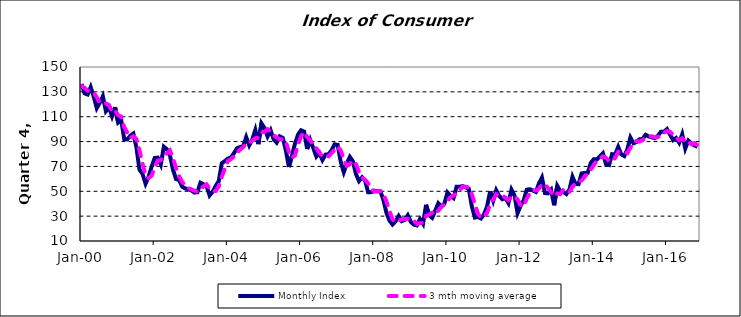
| Category | Monthly Index | 3 mth moving average |
|---|---|---|
| 2000-01-01 | 136.39 | 134.769 |
| 2000-02-01 | 128.83 | 133.196 |
| 2000-03-01 | 127.87 | 131.03 |
| 2000-04-01 | 133.808 | 130.17 |
| 2000-05-01 | 126.234 | 129.304 |
| 2000-06-01 | 116.898 | 125.647 |
| 2000-07-01 | 121.315 | 121.482 |
| 2000-08-01 | 126.388 | 121.534 |
| 2000-09-01 | 114.421 | 120.708 |
| 2000-10-01 | 117.451 | 119.42 |
| 2000-11-01 | 110.366 | 114.079 |
| 2000-12-01 | 117.635 | 115.151 |
| 2001-01-01 | 105.36 | 111.12 |
| 2001-02-01 | 107.559 | 110.184 |
| 2001-03-01 | 92.035 | 101.651 |
| 2001-04-01 | 91.744 | 97.113 |
| 2001-05-01 | 94.719 | 92.833 |
| 2001-06-01 | 96.453 | 94.305 |
| 2001-07-01 | 85.411 | 92.194 |
| 2001-08-01 | 67.414 | 83.093 |
| 2001-09-01 | 64.075 | 72.3 |
| 2001-10-01 | 56.085 | 62.525 |
| 2001-11-01 | 61.702 | 60.621 |
| 2001-12-01 | 69.937 | 62.575 |
| 2002-01-01 | 76.81 | 69.483 |
| 2002-02-01 | 77.08 | 74.609 |
| 2002-03-01 | 71.629 | 75.173 |
| 2002-04-01 | 85.831 | 78.18 |
| 2002-05-01 | 83.795 | 80.418 |
| 2002-06-01 | 78.905 | 82.844 |
| 2002-07-01 | 67.374 | 76.691 |
| 2002-08-01 | 59.832 | 68.703 |
| 2002-09-01 | 59.111 | 62.105 |
| 2002-10-01 | 53.696 | 57.546 |
| 2002-11-01 | 52.312 | 55.04 |
| 2002-12-01 | 51.679 | 52.562 |
| 2003-01-01 | 50.696 | 51.562 |
| 2003-02-01 | 49.029 | 50.468 |
| 2003-03-01 | 49.193 | 49.639 |
| 2003-04-01 | 56.879 | 51.7 |
| 2003-05-01 | 55.689 | 53.92 |
| 2003-06-01 | 54.224 | 55.598 |
| 2003-07-01 | 46.672 | 52.195 |
| 2003-08-01 | 49.648 | 50.182 |
| 2003-09-01 | 54.366 | 50.229 |
| 2003-10-01 | 58.069 | 54.028 |
| 2003-11-01 | 72.593 | 61.676 |
| 2003-12-01 | 74.28 | 68.314 |
| 2004-01-01 | 76.295 | 74.389 |
| 2004-02-01 | 77.202 | 75.925 |
| 2004-03-01 | 80.7 | 78.065 |
| 2004-04-01 | 84.661 | 80.854 |
| 2004-05-01 | 85.54 | 83.634 |
| 2004-06-01 | 86.268 | 85.49 |
| 2004-07-01 | 93.601 | 88.47 |
| 2004-08-01 | 86.964 | 88.944 |
| 2004-09-01 | 91.735 | 90.767 |
| 2004-10-01 | 99.325 | 92.675 |
| 2004-11-01 | 87.933 | 92.998 |
| 2004-12-01 | 104.713 | 97.324 |
| 2005-01-01 | 100.93 | 97.859 |
| 2005-02-01 | 94.183 | 99.942 |
| 2005-03-01 | 99.126 | 98.08 |
| 2005-04-01 | 91.93 | 95.08 |
| 2005-05-01 | 89.176 | 93.411 |
| 2005-06-01 | 94.185 | 91.764 |
| 2005-07-01 | 92.95 | 92.104 |
| 2005-08-01 | 83.038 | 90.058 |
| 2005-09-01 | 69.518 | 81.835 |
| 2005-10-01 | 78.597 | 77.051 |
| 2005-11-01 | 88.285 | 78.8 |
| 2005-12-01 | 95.591 | 87.491 |
| 2006-01-01 | 99.091 | 94.322 |
| 2006-02-01 | 98.049 | 97.577 |
| 2006-03-01 | 83.987 | 93.709 |
| 2006-04-01 | 91.366 | 91.134 |
| 2006-05-01 | 84.819 | 86.724 |
| 2006-06-01 | 77.945 | 84.71 |
| 2006-07-01 | 80.872 | 81.212 |
| 2006-08-01 | 75.132 | 77.983 |
| 2006-09-01 | 79.536 | 78.513 |
| 2006-10-01 | 79.805 | 78.158 |
| 2006-11-01 | 82.924 | 80.755 |
| 2006-12-01 | 87.744 | 83.491 |
| 2007-01-01 | 87.327 | 85.998 |
| 2007-02-01 | 73.76 | 82.944 |
| 2007-03-01 | 65.391 | 75.493 |
| 2007-04-01 | 72.362 | 70.505 |
| 2007-05-01 | 77.669 | 71.807 |
| 2007-06-01 | 74.125 | 74.719 |
| 2007-07-01 | 63.876 | 71.89 |
| 2007-08-01 | 58.244 | 65.415 |
| 2007-09-01 | 61.25 | 61.123 |
| 2007-10-01 | 58.415 | 59.303 |
| 2007-11-01 | 49.237 | 56.301 |
| 2007-12-01 | 49.329 | 52.327 |
| 2008-01-01 | 50.379 | 49.648 |
| 2008-02-01 | 50.116 | 49.941 |
| 2008-03-01 | 49.951 | 50.149 |
| 2008-04-01 | 43.093 | 47.72 |
| 2008-05-01 | 32.628 | 41.891 |
| 2008-06-01 | 26.435 | 34.052 |
| 2008-07-01 | 23.287 | 27.45 |
| 2008-08-01 | 25.847 | 25.19 |
| 2008-09-01 | 30.157 | 26.43 |
| 2008-10-01 | 26.003 | 27.336 |
| 2008-11-01 | 26.977 | 27.712 |
| 2008-12-01 | 30.712 | 27.897 |
| 2009-01-01 | 25.335 | 27.674 |
| 2009-02-01 | 23.103 | 26.383 |
| 2009-03-01 | 22.534 | 23.657 |
| 2009-04-01 | 27.683 | 24.44 |
| 2009-05-01 | 23.806 | 24.674 |
| 2009-06-01 | 39.148 | 30.212 |
| 2009-07-01 | 30.628 | 31.194 |
| 2009-08-01 | 28.613 | 32.796 |
| 2009-09-01 | 34.385 | 31.209 |
| 2009-10-01 | 40.397 | 34.465 |
| 2009-11-01 | 37.75 | 37.51 |
| 2009-12-01 | 40.104 | 39.417 |
| 2010-01-01 | 49.048 | 42.3 |
| 2010-02-01 | 46.301 | 45.151 |
| 2010-03-01 | 44.527 | 46.625 |
| 2010-04-01 | 53.697 | 48.175 |
| 2010-05-01 | 53.722 | 50.649 |
| 2010-06-01 | 54.141 | 53.853 |
| 2010-07-01 | 53.128 | 53.664 |
| 2010-08-01 | 52.073 | 53.114 |
| 2010-09-01 | 37.939 | 47.713 |
| 2010-10-01 | 28.832 | 39.615 |
| 2010-11-01 | 29.359 | 32.043 |
| 2010-12-01 | 28.144 | 28.778 |
| 2011-01-01 | 31.502 | 29.669 |
| 2011-02-01 | 37.76 | 32.469 |
| 2011-03-01 | 49.903 | 39.722 |
| 2011-04-01 | 42.321 | 43.328 |
| 2011-05-01 | 50.793 | 47.672 |
| 2011-06-01 | 46.185 | 46.433 |
| 2011-07-01 | 43.574 | 46.851 |
| 2011-08-01 | 44.527 | 44.762 |
| 2011-09-01 | 40.487 | 42.863 |
| 2011-10-01 | 51.323 | 45.446 |
| 2011-11-01 | 46.574 | 46.128 |
| 2011-12-01 | 32.391 | 43.43 |
| 2012-01-01 | 38.392 | 39.119 |
| 2012-02-01 | 42.713 | 37.832 |
| 2012-03-01 | 51.243 | 44.116 |
| 2012-04-01 | 51.686 | 48.547 |
| 2012-05-01 | 50.586 | 51.172 |
| 2012-06-01 | 49.468 | 50.58 |
| 2012-07-01 | 56.291 | 52.115 |
| 2012-08-01 | 61.037 | 55.598 |
| 2012-09-01 | 48.567 | 55.298 |
| 2012-10-01 | 48.352 | 52.652 |
| 2012-11-01 | 51.207 | 49.375 |
| 2012-12-01 | 38.751 | 46.103 |
| 2013-01-01 | 54.431 | 48.13 |
| 2013-02-01 | 50.041 | 47.741 |
| 2013-03-01 | 49.547 | 51.34 |
| 2013-04-01 | 47.738 | 49.109 |
| 2013-05-01 | 51.26 | 49.515 |
| 2013-06-01 | 61.712 | 53.57 |
| 2013-07-01 | 55.932 | 56.301 |
| 2013-08-01 | 55.724 | 57.789 |
| 2013-09-01 | 64.359 | 58.671 |
| 2013-10-01 | 64.772 | 61.618 |
| 2013-11-01 | 64.842 | 64.658 |
| 2013-12-01 | 72.727 | 67.447 |
| 2014-01-01 | 75.834 | 71.134 |
| 2014-02-01 | 75.611 | 74.724 |
| 2014-03-01 | 78.122 | 76.522 |
| 2014-04-01 | 80.645 | 78.126 |
| 2014-05-01 | 71.833 | 76.867 |
| 2014-06-01 | 71.162 | 74.547 |
| 2014-07-01 | 79.884 | 74.293 |
| 2014-08-01 | 79.606 | 76.884 |
| 2014-09-01 | 85.707 | 81.732 |
| 2014-10-01 | 79.749 | 81.687 |
| 2014-11-01 | 78.367 | 81.274 |
| 2014-12-01 | 83.755 | 80.623 |
| 2015-01-01 | 93.238 | 85.12 |
| 2015-02-01 | 88.642 | 88.545 |
| 2015-03-01 | 89.649 | 90.51 |
| 2015-04-01 | 91.839 | 90.043 |
| 2015-05-01 | 92.205 | 91.231 |
| 2015-06-01 | 95.411 | 93.152 |
| 2015-07-01 | 94.108 | 93.908 |
| 2015-08-01 | 93.4 | 94.306 |
| 2015-09-01 | 92.702 | 93.403 |
| 2015-10-01 | 94.614 | 93.572 |
| 2015-11-01 | 97.924 | 95.08 |
| 2015-12-01 | 97.892 | 96.81 |
| 2016-01-01 | 100.031 | 98.616 |
| 2016-02-01 | 95.541 | 97.821 |
| 2016-03-01 | 91.207 | 95.593 |
| 2016-04-01 | 92.927 | 93.225 |
| 2016-05-01 | 89.076 | 91.07 |
| 2016-06-01 | 95.91 | 92.638 |
| 2016-07-01 | 84.409 | 89.798 |
| 2016-08-01 | 90.774 | 90.364 |
| 2016-09-01 | 88.45 | 87.878 |
| 2016-10-01 | 86.883 | 88.703 |
| 2016-11-01 | 85.768 | 87.034 |